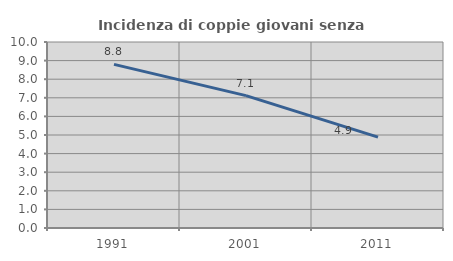
| Category | Incidenza di coppie giovani senza figli |
|---|---|
| 1991.0 | 8.796 |
| 2001.0 | 7.118 |
| 2011.0 | 4.885 |